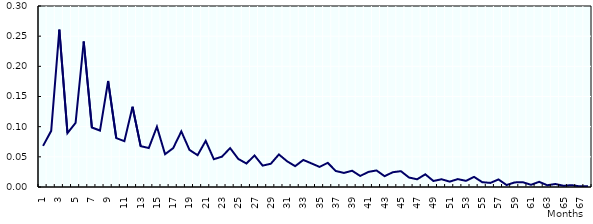
| Category | GMI |
|---|---|
| 1.0 | 0.068 |
| 2.0 | 0.093 |
| 3.0 | 0.261 |
| 4.0 | 0.089 |
| 5.0 | 0.106 |
| 6.0 | 0.241 |
| 7.0 | 0.099 |
| 8.0 | 0.094 |
| 9.0 | 0.176 |
| 10.0 | 0.081 |
| 11.0 | 0.076 |
| 12.0 | 0.133 |
| 13.0 | 0.068 |
| 14.0 | 0.065 |
| 15.0 | 0.1 |
| 16.0 | 0.054 |
| 17.0 | 0.064 |
| 18.0 | 0.092 |
| 19.0 | 0.062 |
| 20.0 | 0.053 |
| 21.0 | 0.076 |
| 22.0 | 0.046 |
| 23.0 | 0.05 |
| 24.0 | 0.064 |
| 25.0 | 0.047 |
| 26.0 | 0.039 |
| 27.0 | 0.052 |
| 28.0 | 0.035 |
| 29.0 | 0.038 |
| 30.0 | 0.054 |
| 31.0 | 0.043 |
| 32.0 | 0.035 |
| 33.0 | 0.045 |
| 34.0 | 0.039 |
| 35.0 | 0.033 |
| 36.0 | 0.04 |
| 37.0 | 0.027 |
| 38.0 | 0.023 |
| 39.0 | 0.027 |
| 40.0 | 0.018 |
| 41.0 | 0.025 |
| 42.0 | 0.027 |
| 43.0 | 0.018 |
| 44.0 | 0.025 |
| 45.0 | 0.026 |
| 46.0 | 0.016 |
| 47.0 | 0.013 |
| 48.0 | 0.021 |
| 49.0 | 0.01 |
| 50.0 | 0.013 |
| 51.0 | 0.009 |
| 52.0 | 0.013 |
| 53.0 | 0.01 |
| 54.0 | 0.017 |
| 55.0 | 0.008 |
| 56.0 | 0.007 |
| 57.0 | 0.012 |
| 58.0 | 0.003 |
| 59.0 | 0.008 |
| 60.0 | 0.008 |
| 61.0 | 0.004 |
| 62.0 | 0.009 |
| 63.0 | 0.003 |
| 64.0 | 0.005 |
| 65.0 | 0.002 |
| 66.0 | 0.003 |
| 67.0 | 0.001 |
| 68.0 | 0.001 |